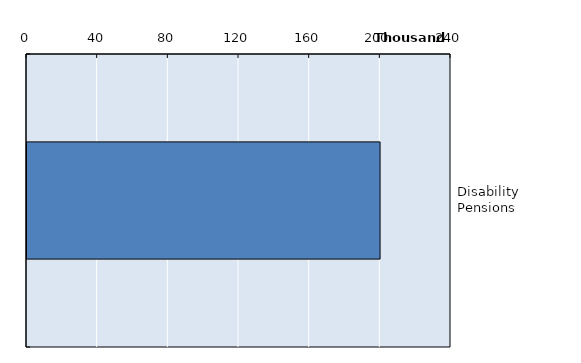
| Category | Series 0 |
|---|---|
| Disability Pensions | 199850 |